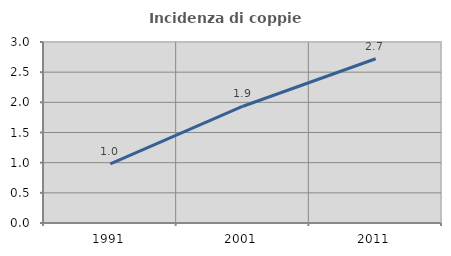
| Category | Incidenza di coppie miste |
|---|---|
| 1991.0 | 0.98 |
| 2001.0 | 1.935 |
| 2011.0 | 2.722 |